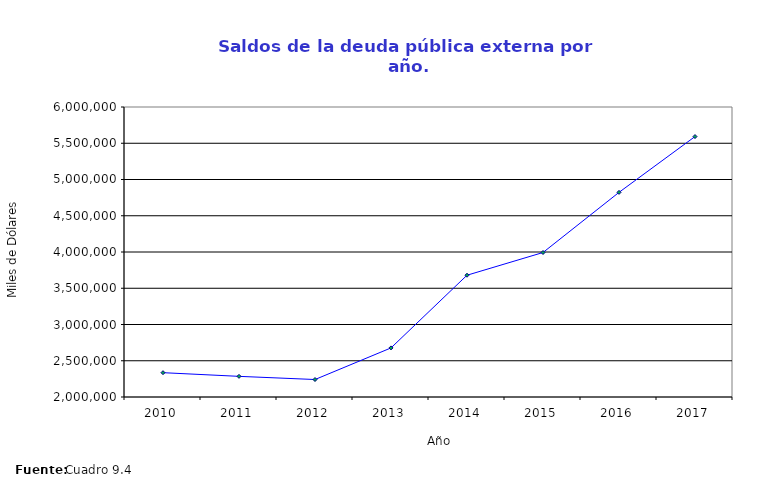
| Category | Saldos |
|---|---|
| 2010.0 | 2335425 |
| 2011.0 | 2284723 |
| 2012.0 | 2241060 |
| 2013.0 | 2677032 |
| 2014.0 | 3679598 |
| 2015.0 | 3993084 |
| 2016.0 | 4822606 |
| 2017.0 | 5592272 |